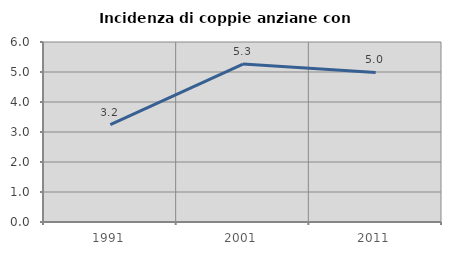
| Category | Incidenza di coppie anziane con figli |
|---|---|
| 1991.0 | 3.247 |
| 2001.0 | 5.263 |
| 2011.0 | 4.985 |